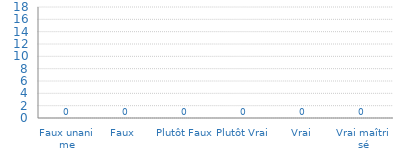
| Category | Histogramme de Véracité des Processus
Organisation |
|---|---|
| Faux unanime | 0 |
| Faux  | 0 |
| Plutôt Faux | 0 |
| Plutôt Vrai | 0 |
| Vrai  | 0 |
| Vrai maîtrisé | 0 |